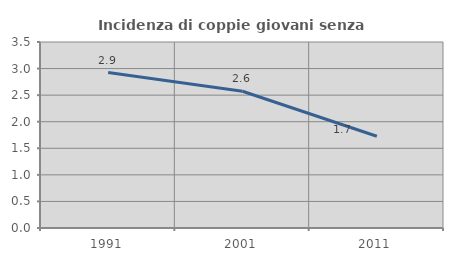
| Category | Incidenza di coppie giovani senza figli |
|---|---|
| 1991.0 | 2.926 |
| 2001.0 | 2.573 |
| 2011.0 | 1.726 |